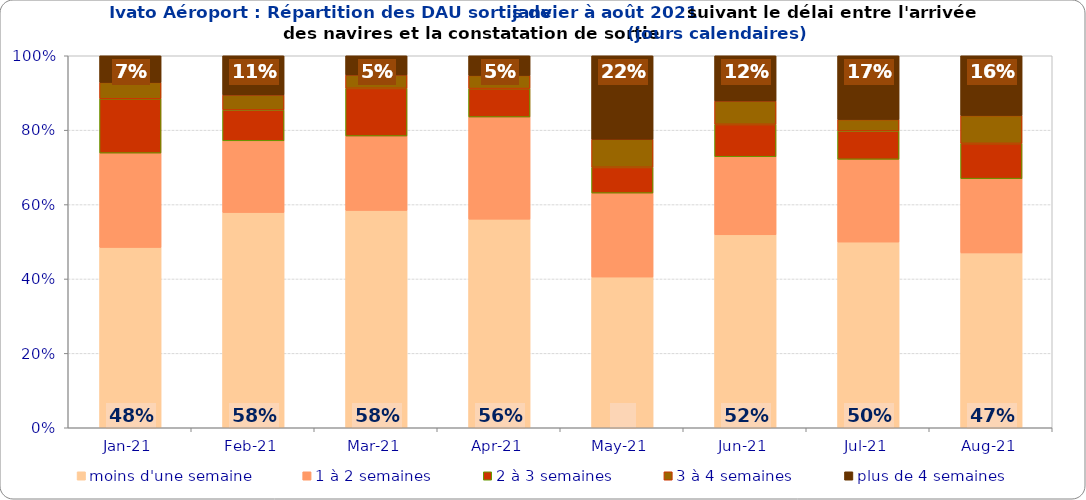
| Category | moins d'une semaine | 1 à 2 semaines | 2 à 3 semaines | 3 à 4 semaines | plus de 4 semaines |
|---|---|---|---|---|---|
| 2021-01-01 | 0.485 | 0.253 | 0.146 | 0.044 | 0.072 |
| 2021-02-01 | 0.578 | 0.193 | 0.083 | 0.04 | 0.105 |
| 2021-03-01 | 0.584 | 0.2 | 0.128 | 0.036 | 0.052 |
| 2021-04-01 | 0.561 | 0.275 | 0.076 | 0.035 | 0.053 |
| 2021-05-01 | 0.405 | 0.226 | 0.069 | 0.076 | 0.224 |
| 2021-06-01 | 0.519 | 0.21 | 0.087 | 0.063 | 0.122 |
| 2021-07-01 | 0.499 | 0.222 | 0.076 | 0.031 | 0.171 |
| 2021-08-01 | 0.47 | 0.2 | 0.095 | 0.075 | 0.161 |